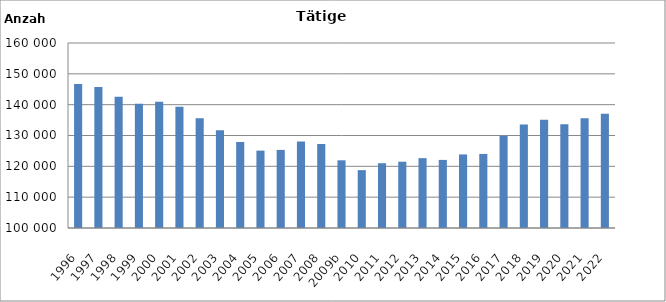
| Category | Series 0 |
|---|---|
| 1996 | 146742 |
| 1997 | 145717 |
| 1998 | 142598 |
| 1999 | 140319 |
| 2000 | 140983 |
| 2001 | 139341 |
| 2002 | 135596 |
| 2003 | 131743 |
| 2004 | 127904 |
| 2005 | 125099 |
| 2006 | 125327 |
| 2007 | 128030 |
| 2008 | 127238 |
| 2009b | 121954 |
| 2010 | 118762 |
| 2011 | 121003 |
| 2012 | 121500 |
| 2013 | 122658 |
| 2014 | 122086 |
| 2015 | 123861 |
| 2016 | 124018 |
| 2017 | 129935 |
| 2018 | 133536 |
| 2019 | 135140 |
| 2020 | 133658 |
| 2021 | 135579 |
| 2022 | 137016 |